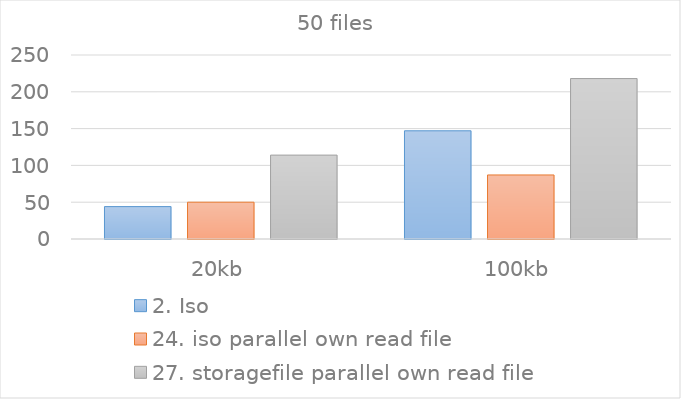
| Category | 2. Iso | 24. iso parallel own read file | 27. storagefile parallel own read file |
|---|---|---|---|
| 20kb | 44 | 50 | 114 |
| 100kb | 147 | 87 | 218 |